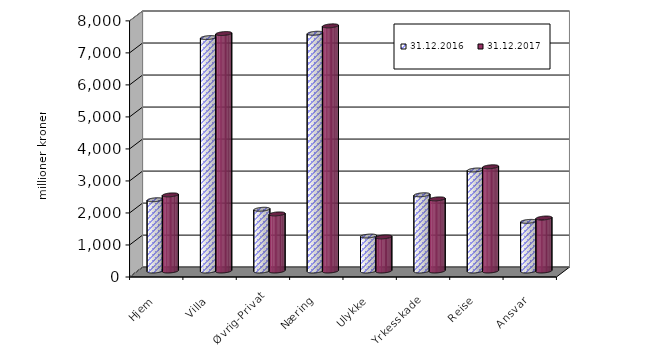
| Category | 31.12.2016 | 31.12.2017 |
|---|---|---|
| Hjem | 2225.564 | 2377.827 |
| Villa | 7290.958 | 7416.783 |
| Øvrig-Privat | 1928.259 | 1783.724 |
| Næring | 7426.159 | 7657.329 |
| Ulykke | 1091.9 | 1065.668 |
| Yrkesskade | 2381.024 | 2252.802 |
| Reise | 3154.663 | 3255.738 |
| Ansvar | 1550.378 | 1654.829 |